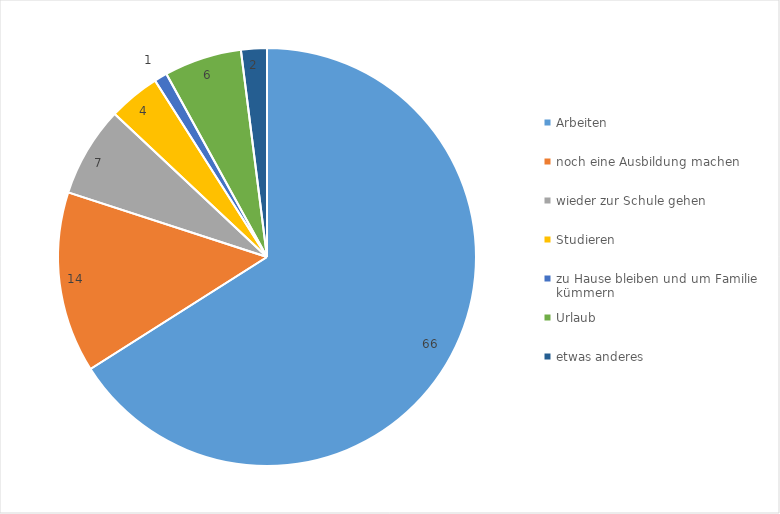
| Category | Series 0 |
|---|---|
| Arbeiten | 66 |
| noch eine Ausbildung machen | 14 |
| wieder zur Schule gehen | 7 |
| Studieren | 4 |
| zu Hause bleiben und um Familie kümmern | 1 |
| Urlaub | 6 |
| etwas anderes | 2 |